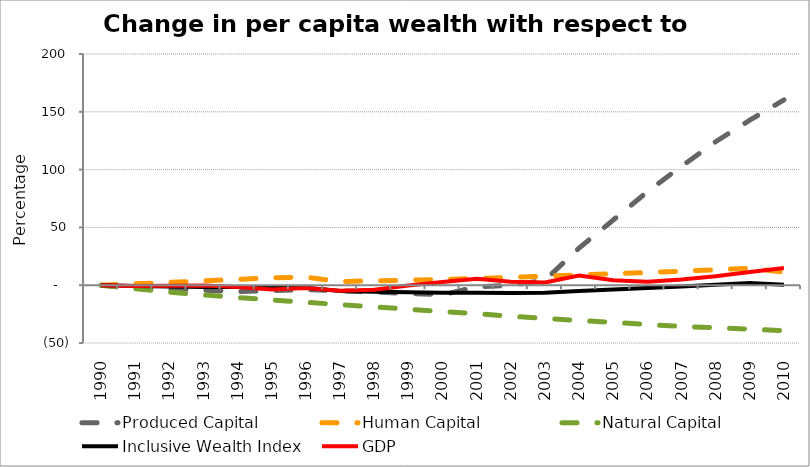
| Category | Produced Capital  | Human Capital | Natural Capital | Inclusive Wealth Index | GDP |
|---|---|---|---|---|---|
| 1990.0 | 0 | 0 | 0 | 0 | 0 |
| 1991.0 | -2.084 | 1.18 | -3.048 | -0.657 | -0.727 |
| 1992.0 | -3.452 | 2.401 | -6.049 | -1.23 | -0.471 |
| 1993.0 | -4.242 | 3.694 | -8.402 | -1.478 | -0.262 |
| 1994.0 | -5.588 | 5.076 | -10.588 | -1.644 | -1.522 |
| 1995.0 | -4.617 | 6.477 | -12.714 | -1.639 | -3.754 |
| 1996.0 | -3.747 | 6.94 | -14.792 | -2.139 | -2.448 |
| 1997.0 | -4.759 | 3.177 | -16.809 | -5.06 | -4.74 |
| 1998.0 | -5.975 | 3.79 | -18.829 | -5.579 | -3.99 |
| 1999.0 | -7.08 | 4.388 | -20.784 | -6.074 | -0.286 |
| 2000.0 | -8.202 | 4.954 | -22.726 | -6.582 | 2.829 |
| 2001.0 | -1.526 | 5.737 | -24.598 | -6.481 | 5.634 |
| 2002.0 | -0.047 | 6.741 | -26.84 | -6.71 | 3.005 |
| 2003.0 | 4.343 | 7.745 | -28.715 | -6.623 | 2.271 |
| 2004.0 | 32.142 | 8.796 | -30.504 | -5.085 | 8.426 |
| 2005.0 | 56.363 | 9.89 | -32.153 | -3.681 | 4.371 |
| 2006.0 | 80.818 | 10.96 | -34.073 | -2.383 | 3.077 |
| 2007.0 | 102.877 | 12.132 | -35.672 | -1.044 | 4.901 |
| 2008.0 | 124.109 | 13.373 | -36.852 | 0.445 | 7.731 |
| 2009.0 | 142.765 | 14.653 | -38.039 | 1.8 | 11.373 |
| 2010.0 | 160.293 | 11.341 | -39.43 | 0.473 | 14.95 |